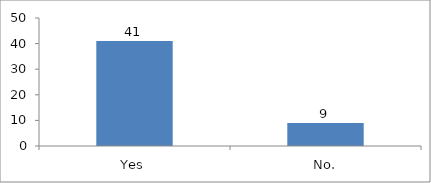
| Category | Would you like to recommend this session to your friend or colleague? |
|---|---|
| Yes | 41 |
| No. | 9 |